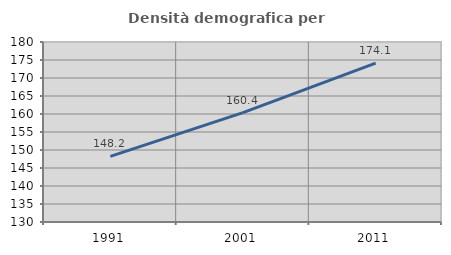
| Category | Densità demografica |
|---|---|
| 1991.0 | 148.236 |
| 2001.0 | 160.402 |
| 2011.0 | 174.117 |